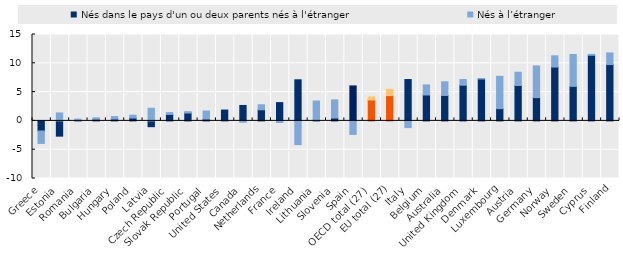
| Category | Nés dans le pays d'un ou deux parents nés à l'étranger | Nés à l’étranger |
|---|---|---|
| Greece | -1.753 | -2.163 |
| Estonia | -2.648 | 1.379 |
| Romania | 0.044 | 0.266 |
| Bulgaria | 0.291 | 0.244 |
| Hungary | 0.32 | 0.43 |
| Poland | 0.502 | 0.486 |
| Latvia | -1.004 | 2.196 |
| Czech Republic | 1.119 | 0.324 |
| Slovak Republic | 1.367 | 0.245 |
| Portugal | 0.317 | 1.395 |
| United States | 1.882 | -0.108 |
| Canada | 2.682 | -0.235 |
| Netherlands | 1.932 | 0.869 |
| France | 3.174 | -0.282 |
| Ireland | 7.136 | -4.118 |
| Lithuania | 0.108 | 3.342 |
| Slovenia | 0.495 | 3.156 |
| Spain | 6.073 | -2.345 |
| OECD total (27) | 3.631 | 0.528 |
| EU total (27) | 4.395 | 1.092 |
| Italy | 7.181 | -1.159 |
| Belgium | 4.5 | 1.75 |
| Australia | 4.416 | 2.37 |
| United Kingdom | 6.198 | 0.991 |
| Denmark | 7.274 | 0.072 |
| Luxembourg | 2.127 | 5.615 |
| Austria | 6.144 | 2.304 |
| Germany | 4.048 | 5.493 |
| Norway | 9.346 | 1.953 |
| Sweden | 5.995 | 5.537 |
| Cyprus | 11.387 | 0.173 |
| Finland | 9.779 | 2.023 |